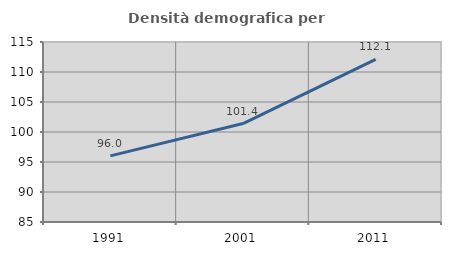
| Category | Densità demografica |
|---|---|
| 1991.0 | 96.019 |
| 2001.0 | 101.406 |
| 2011.0 | 112.116 |